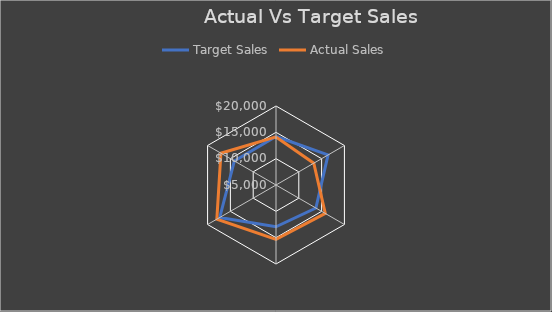
| Category | Target Sales | Actual Sales |
|---|---|---|
| Television | 14209 | 14134 |
| Laptop | 16411 | 13284 |
| Smartphone | 13746 | 15803 |
| Washing Machine | 12938 | 15327 |
| Air Conditioner | 17335 | 17971 |
| Refrigerator | 14131 | 17078 |